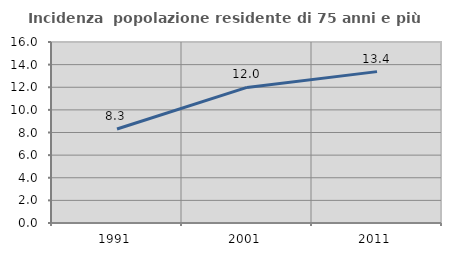
| Category | Incidenza  popolazione residente di 75 anni e più |
|---|---|
| 1991.0 | 8.308 |
| 2001.0 | 11.986 |
| 2011.0 | 13.382 |